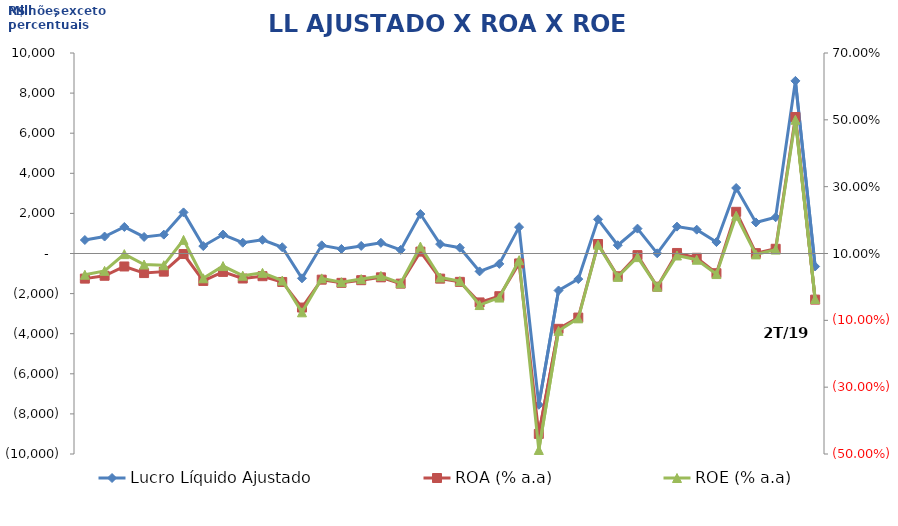
| Category | Lucro Líquido Ajustado |
|---|---|
| 1T/10 | 673 |
| 2T/10 | 846 |
| 3T/10 | 1324 |
| 4T/10 | 826 |
| 1T/11 | 941.311 |
| 2T/11 | 2050 |
| 3T/11 | 370.881 |
| 4T/11 | 944.308 |
| 1T/12 | 538 |
| 2T/12 | 684 |
| 3T/12 | 312 |
| 4T/12 | -1236 |
| 1T/13 | 409.127 |
| 2T/13 | 228.061 |
| 3T/13 | 377.39 |
| 4T/13 | 533.986 |
| 1T/14 | 180.891 |
| 2T/14 | 1968.387 |
| 3T/14 | 467.653 |
| 4T/14 | 287.916 |
| 1T/15 | -891.973 |
| 2T/15 | -519.167 |
| 3T/15 | 1314.23 |
| 4T/15 | -7544.683 |
| 1T/16 | -1844.43 |
| 2T/16 | -1275.998 |
| 3T/16 | 1705.152 |
| 4T/16 | 412.309 |
| 1T/17 | 1240.976 |
| 2T/17 | 9 |
| 3T/17 | 1340 |
| 4T/17 | 1188 |
| 1T/18 | 570 |
| 2T/18 | 3267 |
| 3T/18 | 1550 |
| 4T/18 | 1807 |
| 1T/19 | 8610 |